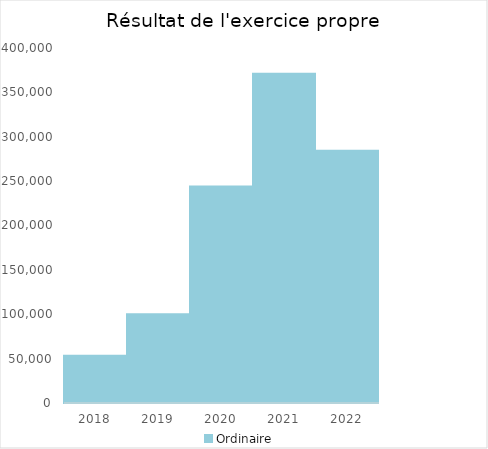
| Category |   | Ordinaire |    |
|---|---|---|---|
| 2018.0 |  | 53282.87 |  |
| 2019.0 |  | 100047.75 |  |
| 2020.0 |  | 244063.52 |  |
| 2021.0 |  | 370992.32 |  |
| 2022.0 |  | 284257.43 |  |